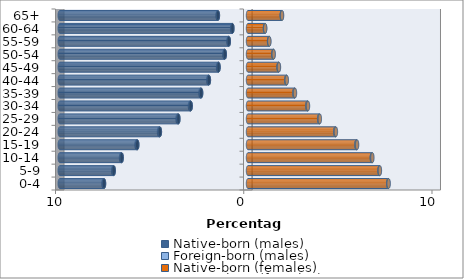
| Category | Native-born (males) | Foreign-born (males) | Native-born (females) | Foreign-born (females) |
|---|---|---|---|---|
| 0-4 | -7.649 | -0.028 | 7.448 | 0.023 |
| 5-9 | -7.134 | -0.028 | 6.984 | 0.023 |
| 10-14 | -6.71 | -0.035 | 6.579 | 0.028 |
| 15-19 | -5.883 | -0.04 | 5.762 | 0.033 |
| 20-24 | -4.681 | -0.044 | 4.634 | 0.037 |
| 25-29 | -3.699 | -0.043 | 3.78 | 0.037 |
| 30-34 | -3.044 | -0.041 | 3.153 | 0.035 |
| 35-39 | -2.49 | -0.035 | 2.465 | 0.03 |
| 40-44 | -2.078 | -0.029 | 2.034 | 0.026 |
| 45-49 | -1.565 | -0.024 | 1.623 | 0.021 |
| 50-54 | -1.233 | -0.02 | 1.346 | 0.018 |
| 55-59 | -1.02 | -0.016 | 1.119 | 0.015 |
| 60-64 | -0.829 | -0.014 | 0.902 | 0.012 |
| 65+ | -1.599 | -0.014 | 1.794 | 0.015 |